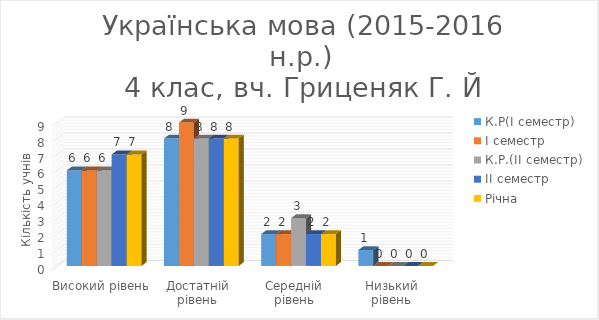
| Category | К.Р(І семестр) | І семестр | К.Р.(ІІ семестр) | ІІ семестр | Річна |
|---|---|---|---|---|---|
| Високий рівень | 6 | 6 | 6 | 7 | 7 |
| Достатній рівень | 8 | 9 | 8 | 8 | 8 |
| Середній рівень | 2 | 2 | 3 | 2 | 2 |
| Низький рівень | 1 | 0 | 0 | 0 | 0 |